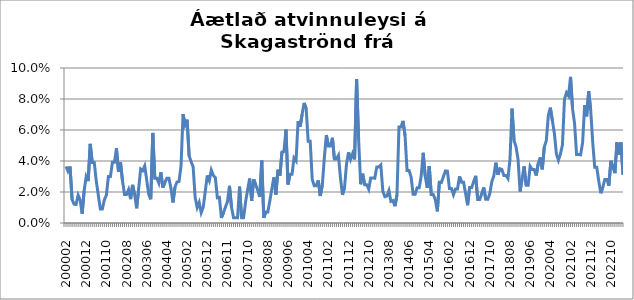
| Category | Series 0 |
|---|---|
| 200002 | 0.036 |
| 200003 | 0.033 |
| 200004 | 0.036 |
| 200005 | 0.015 |
| 200006 | 0.012 |
| 200007 | 0.012 |
| 200008 | 0.018 |
| 200009 | 0.015 |
| 200010 | 0.006 |
| 200011 | 0.021 |
| 200012 | 0.03 |
| 200101 | 0.027 |
| 200102 | 0.051 |
| 200103 | 0.039 |
| 200104 | 0.039 |
| 200105 | 0.027 |
| 200106 | 0.018 |
| 200107 | 0.009 |
| 200108 | 0.009 |
| 200109 | 0.015 |
| 200110 | 0.018 |
| 200111 | 0.03 |
| 200112 | 0.03 |
| 200201 | 0.039 |
| 200202 | 0.039 |
| 200203 | 0.048 |
| 200204 | 0.033 |
| 200205 | 0.039 |
| 200206 | 0.027 |
| 200207 | 0.018 |
| 200208 | 0.018 |
| 200209 | 0.022 |
| 200210 | 0.015 |
| 200211 | 0.025 |
| 200212 | 0.018 |
| 200301 | 0.009 |
| 200302 | 0.022 |
| 200303 | 0.035 |
| 200304 | 0.034 |
| 200305 | 0.037 |
| 200306 | 0.028 |
| 200307 | 0.018 |
| 200308 | 0.015 |
| 200309 | 0.058 |
| 200310 | 0.029 |
| 200311 | 0.029 |
| 200312 | 0.026 |
| 200401 | 0.033 |
| 200402 | 0.023 |
| 200403 | 0.026 |
| 200404 | 0.029 |
| 200405 | 0.029 |
| 200406 | 0.023 |
| 200407 | 0.013 |
| 200408 | 0.023 |
| 200409 | 0.026 |
| 200410 | 0.027 |
| 200411 | 0.037 |
| 200412 | 0.07 |
| 200501 | 0.063 |
| 200502 | 0.067 |
| 200503 | 0.043 |
| 200504 | 0.039 |
| 200505 | 0.036 |
| 200506 | 0.016 |
| 200507 | 0.01 |
| 200508 | 0.013 |
| 200509 | 0.007 |
| 200510 | 0.01 |
| 200511 | 0.02 |
| 200512 | 0.031 |
| 200601 | 0.027 |
| 200602 | 0.034 |
| 200603 | 0.031 |
| 200604 | 0.029 |
| 200605 | 0.016 |
| 200607 | 0.017 |
| 200608 | 0.003 |
| 200609 | 0.007 |
| 200610 | 0.01 |
| 200611 | 0.014 |
| 200612 | 0.024 |
| 200701 | 0.01 |
| 200702 | 0.003 |
| 200703 | 0.003 |
| 200704 | 0.003 |
| 200705 | 0.023 |
| 200706 | 0.003 |
| 200708 | 0.003 |
| 200709 | 0.014 |
| 200710 | 0.022 |
| 200711 | 0.029 |
| 200712 | 0.014 |
| 200801 | 0.028 |
| 200802 | 0.025 |
| 200803 | 0.021 |
| 200804 | 0.017 |
| 200805 | 0.04 |
| 200806 | 0.003 |
| 200807 | 0.007 |
| 200808 | 0.007 |
| 200809 | 0.014 |
| 200810 | 0.022 |
| 200811 | 0.029 |
| 200812 | 0.018 |
| 200901 | 0.034 |
| 200902 | 0.031 |
| 200903 | 0.046 |
| 200904 | 0.046 |
| 200905 | 0.06 |
| 200906 | 0.025 |
| 200907 | 0.031 |
| 200908 | 0.031 |
| 200909 | 0.042 |
| 200910 | 0.04 |
| 200911 | 0.066 |
| 200912 | 0.062 |
| 201001 | 0.07 |
| 201002 | 0.077 |
| 201003 | 0.074 |
| 201004 | 0.053 |
| 201005 | 0.053 |
| 201006 | 0.028 |
| 201007 | 0.024 |
| 201008 | 0.024 |
| 201009 | 0.027 |
| 201010 | 0.017 |
| 201011 | 0.024 |
| 201012 | 0.042 |
| 201101 | 0.057 |
| 201102 | 0.05 |
| 201103 | 0.05 |
| 201104 | 0.055 |
| 201105 | 0.041 |
| 201106 | 0.041 |
| 201107 | 0.044 |
| 201108 | 0.029 |
| 201109 | 0.018 |
| 201110 | 0.023 |
| 201111 | 0.038 |
| 201112 | 0.046 |
| 201201 | 0.041 |
| 201202 | 0.045 |
| 201203 | 0.041 |
| 201204 | 0.093 |
| 201205 | 0.054 |
| 201206 | 0.025 |
| 201207 | 0.032 |
| 201208 | 0.025 |
| 201209 | 0.025 |
| 201210 | 0.022 |
| 201211 | 0.029 |
| 201212 | 0.029 |
| 201301 | 0.029 |
| 201302 | 0.036 |
| 201303 | 0.036 |
| 201304 | 0.037 |
| 201305 | 0.02 |
| 201306 | 0.017 |
| 201307 | 0.017 |
| 201308 | 0.021 |
| 201309 | 0.014 |
| 201310 | 0.014 |
| 201311 | 0.011 |
| 201312 | 0.018 |
| 201401 | 0.062 |
| 201402 | 0.062 |
| 201403 | 0.066 |
| 201404 | 0.056 |
| 201405 | 0.034 |
| 201406 | 0.034 |
| 201407 | 0.03 |
| 201408 | 0.019 |
| 201409 | 0.019 |
| 201410 | 0.023 |
| 201411 | 0.023 |
| 201412 | 0.03 |
| 201501 | 0.045 |
| 201502 | 0.03 |
| 201503 | 0.023 |
| 201504 | 0.037 |
| 201505 | 0.018 |
| 201506 | 0.018 |
| 201507 | 0.015 |
| 201508 | 0.008 |
| 201509 | 0.026 |
| 201510 | 0.026 |
| 201511 | 0.03 |
| 201512 | 0.034 |
| 201601 | 0.033 |
| 201602 | 0.022 |
| 201603 | 0.022 |
| 201604 | 0.018 |
| 201605 | 0.022 |
| 201606 | 0.022 |
| 201607 | 0.03 |
| 201608 | 0.026 |
| 201609 | 0.026 |
| 201610 | 0.019 |
| 201611 | 0.011 |
| 201612 | 0.023 |
| 201701 | 0.023 |
| 201702 | 0.027 |
| 201703 | 0.03 |
| 201704 | 0.015 |
| 201705 | 0.015 |
| 201706 | 0.019 |
| 201707 | 0.023 |
| 201708 | 0.015 |
| 201709 | 0.015 |
| 201710 | 0.019 |
| 201711 | 0.027 |
| 201712 | 0.03 |
| 201801 | 0.039 |
| 201802 | 0.031 |
| 201803 | 0.035 |
| 201804 | 0.034 |
| 201805 | 0.031 |
| 201806 | 0.031 |
| 201807 | 0.029 |
| 201808 | 0.041 |
| 201809 | 0.074 |
| 201810 | 0.053 |
| 201811 | 0.049 |
| 201812 | 0.041 |
| 201901 | 0.02 |
| 201902 | 0.028 |
| 201903 | 0.037 |
| 201904 | 0.024 |
| 201905 | 0.024 |
| 201906 | 0.037 |
| 201907 | 0.034 |
| 201908 | 0.034 |
| 201909 | 0.031 |
| 201910 | 0.038 |
| 201911 | 0.042 |
| 201912 | 0.035 |
| 202001 | 0.049 |
| 202002 | 0.053 |
| 202003 | 0.069 |
| 202004 | 0.074 |
| 202005 | 0.066 |
| 202006 | 0.058 |
| 202007 | 0.045 |
| 202008 | 0.04 |
| 202009 | 0.045 |
| 202010 | 0.05 |
| 202011 | 0.08 |
| 202012 | 0.084 |
| 202101 | 0.082 |
| 202102 | 0.094 |
| 202103 | 0.074 |
| 202104 | 0.064 |
| 202105 | 0.044 |
| 202106 | 0.044 |
| 202107 | 0.044 |
| 202108 | 0.052 |
| 202109 | 0.076 |
| 202110 | 0.069 |
| 202111 | 0.085 |
| 202112 | 0.073 |
| 202201 | 0.052 |
| 202202 | 0.036 |
| 202203 | 0.036 |
| 202204 | 0.027 |
| 202205 | 0.019 |
| 202206 | 0.023 |
| 202207 | 0.028 |
| 202208 | 0.028 |
| 202209 | 0.024 |
| 202210 | 0.04 |
| 202211 | 0.036 |
| 202212 | 0.032 |
| 202301 | 0.052 |
| 202302 | 0.044 |
| 202303 | 0.052 |
| 202304 | 0.031 |